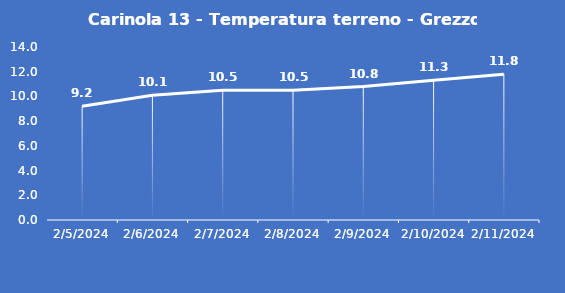
| Category | Carinola 13 - Temperatura terreno - Grezzo (°C) |
|---|---|
| 2/5/24 | 9.2 |
| 2/6/24 | 10.1 |
| 2/7/24 | 10.5 |
| 2/8/24 | 10.5 |
| 2/9/24 | 10.8 |
| 2/10/24 | 11.3 |
| 2/11/24 | 11.8 |